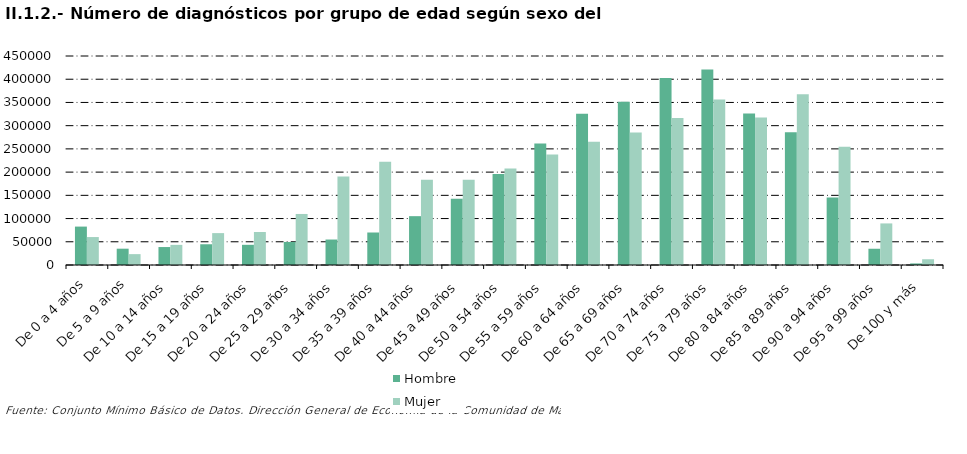
| Category | Hombre | Mujer |
|---|---|---|
| De 0 a 4 años | 82697 | 60184 |
| De 5 a 9 años | 35117 | 23398 |
| De 10 a 14 años | 38678 | 43347 |
| De 15 a 19 años | 44659 | 68671 |
| De 20 a 24 años | 43457 | 70994 |
| De 25 a 29 años | 49591 | 109880 |
| De 30 a 34 años | 54839 | 190451 |
| De 35 a 39 años | 69981 | 222369 |
| De 40 a 44 años | 105154 | 183504 |
| De 45 a 49 años | 142584 | 183356 |
| De 50 a 54 años | 195767 | 207794 |
| De 55 a 59 años | 261521 | 237968 |
| De 60 a 64 años | 325459 | 265432 |
| De 65 a 69 años | 351589 | 285137 |
| De 70 a 74 años | 402468 | 316420 |
| De 75 a 79 años | 420945 | 356237 |
| De 80 a 84 años | 326143 | 317579 |
| De 85 a 89 años | 285605 | 367402 |
| De 90 a 94 años | 145241 | 254434 |
| De 95 a 99 años | 34987 | 89534 |
| De 100 y más | 3371 | 12376 |